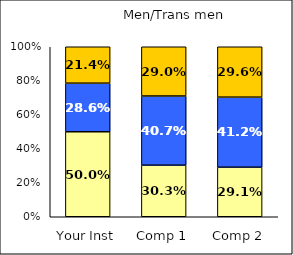
| Category | Low Civic Minded Practice | Average Civic Minded Practice | High Civic Minded Practice |
|---|---|---|---|
| Your Inst | 0.5 | 0.286 | 0.214 |
| Comp 1 | 0.303 | 0.407 | 0.29 |
| Comp 2 | 0.291 | 0.412 | 0.296 |